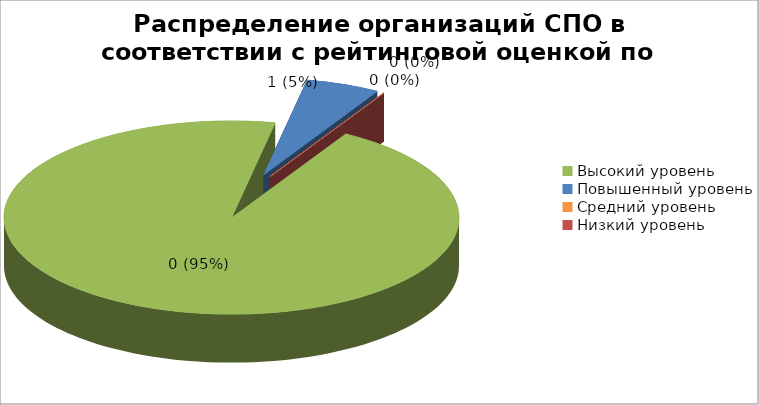
| Category | Series 8 | Series 9 |
|---|---|---|
| Высокий уровень | 0.947 |  |
| Повышенный уровень | 0.053 |  |
| Средний уровень | 0 |  |
| Низкий уровень | 0 |  |